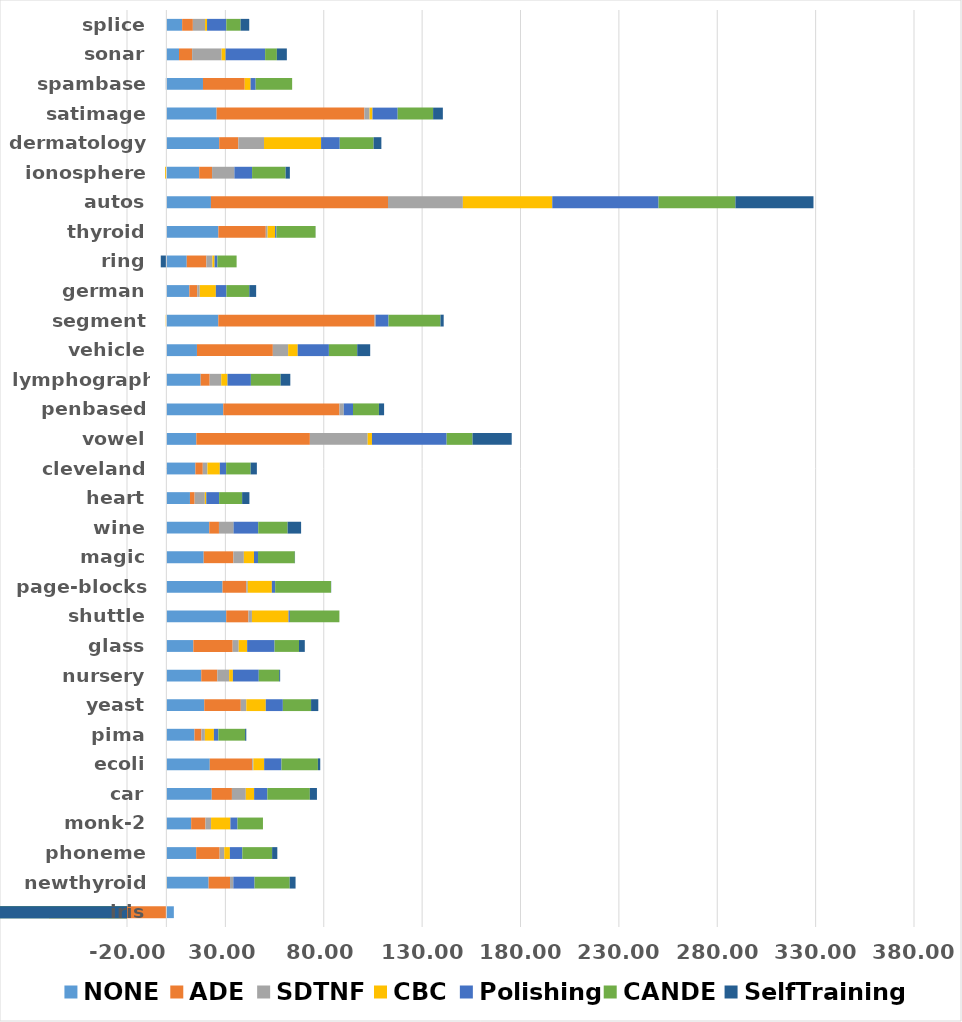
| Category | NONE | ADE | SDTNF | CBC | Polishing | CANDE | SelfTraining |
|---|---|---|---|---|---|---|---|
| iris | 3.81 | -29.767 | -29.9 | -36.833 | -29.633 | -18.833 | -32.967 |
| newthyroid | 21.488 | 10.884 | 1.674 | -0.186 | 10.791 | 17.86 | 2.977 |
| phoneme | 15.166 | 11.915 | 2.346 | 2.861 | 6.332 | 15.141 | 2.642 |
| monk-2 | 12.612 | 7.285 | 2.83 | 9.824 | 3.623 | 12.932 | -0.136 |
| car | 23.079 | 10.255 | 7.049 | 4.225 | 6.736 | 21.586 | 3.61 |
| ecoli | 22.081 | 21.559 | 0.594 | 5.476 | 8.809 | 18.509 | 1.197 |
| pima | 14.299 | 3.535 | 1.747 | 4.586 | 2.272 | 13.595 | 0.599 |
| yeast | 19.27 | 18.573 | 2.802 | 9.893 | 8.678 | 14.338 | 3.68 |
| nursery | 17.746 | 8.178 | 5.988 | 1.914 | 13.148 | 10.385 | 0.479 |
| glass | 13.714 | 19.996 | 3.068 | 4.29 | 13.931 | 12.412 | 2.957 |
| shuttle | 30.437 | 11.292 | 1.775 | 18.611 | 0.68 | 25.159 | 0 |
| page-blocks | 28.556 | 12.057 | 0.782 | 12.229 | 1.678 | 28.381 | 0.088 |
| magic | 18.977 | 15.083 | 5.34 | 5.143 | 2.05 | 18.706 | 0.101 |
| wine | 21.813 | 4.93 | 7.267 | 0.086 | 12.6 | 14.946 | 6.851 |
| heart | 12 | 2.37 | 5.185 | 0.741 | 6.519 | 11.704 | 3.704 |
| cleveland | 14.754 | 3.774 | 2.366 | 6.278 | 3.215 | 12.459 | 3.165 |
| vowel | 15.232 | 57.717 | 29.374 | 2.182 | 37.96 | 13.152 | 19.919 |
| penbased | 28.936 | 59.045 | 2.069 | 0.053 | 4.754 | 13.201 | 2.615 |
| lymphography | 17.43 | 4.598 | 5.871 | 3.191 | 11.88 | 15.103 | 4.929 |
| vehicle | 15.557 | 38.572 | 7.778 | 4.848 | 15.863 | 14.397 | 6.594 |
| segment | 26.416 | 79.42 | 0.545 | -0.32 | 6.537 | 26.416 | 1.628 |
| german | 11.7 | 4 | 1.28 | 8.18 | 5.38 | 11.62 | 3.48 |
| ring | 10.368 | 9.978 | 3.059 | 1.103 | 1.446 | 9.759 | -2.841 |
| thyroid | 26.442 | 24.097 | 0.936 | 3.786 | 0.686 | 19.897 | 0.028 |
| autos | 22.667 | 89.992 | 38.052 | 45.439 | 54.028 | 39.056 | 39.673 |
| ionosphere | 16.698 | 6.537 | 11.343 | -0.693 | 8.994 | 17.045 | 2.162 |
| dermatology | 26.861 | 9.72 | 13.063 | 29.001 | 9.49 | 17.193 | 3.961 |
| satimage | 25.532 | 75.114 | 2.645 | 1.479 | 12.802 | 18.008 | 4.957 |
| spambase | 18.616 | 21.218 | -0.183 | 2.967 | 2.602 | 18.534 | -0.061 |
| sonar | 6.441 | 6.657 | 14.994 | 2.014 | 20.093 | 5.972 | 5.075 |
| splice | 8.023 | 5.455 | 6.197 | 1.009 | 9.783 | 7.267 | 4.393 |